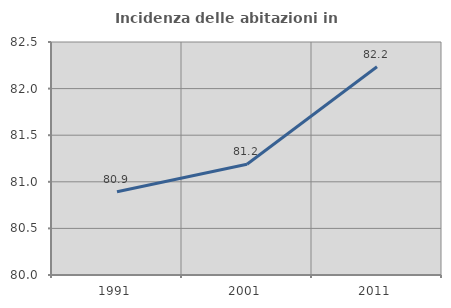
| Category | Incidenza delle abitazioni in proprietà  |
|---|---|
| 1991.0 | 80.892 |
| 2001.0 | 81.188 |
| 2011.0 | 82.234 |